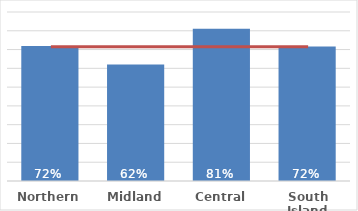
| Category | Dep 5 |
|---|---|
| Northern | 0.719 |
| Midland | 0.621 |
| Central | 0.811 |
| South Island | 0.716 |